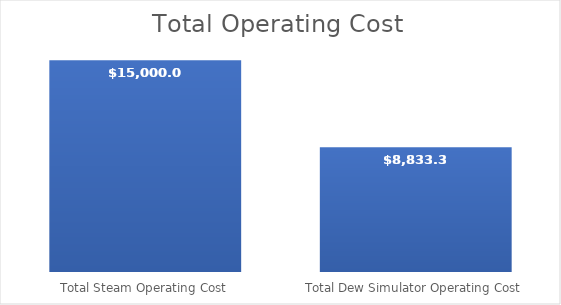
| Category | Series 0 |
|---|---|
| Total Steam Operating Cost | 15000 |
| Total Dew Simulator Operating Cost | 8833.333 |